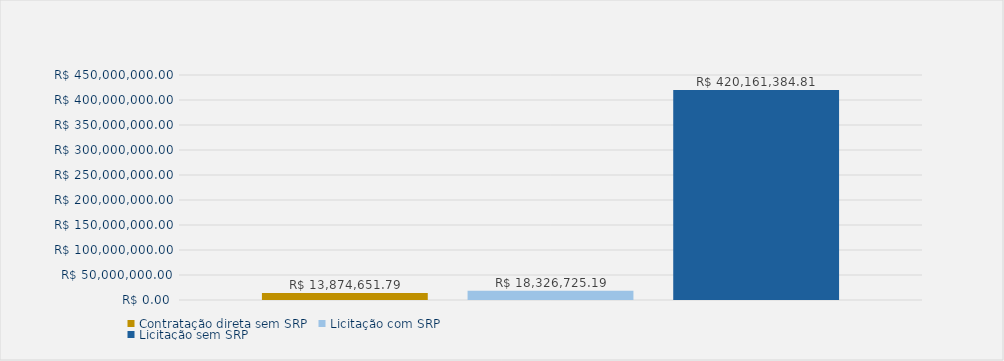
| Category | Contratação direta sem SRP | Licitação com SRP | Licitação sem SRP |
|---|---|---|---|
| Total | 13874651.79 | 18326725.19 | 420161384.81 |